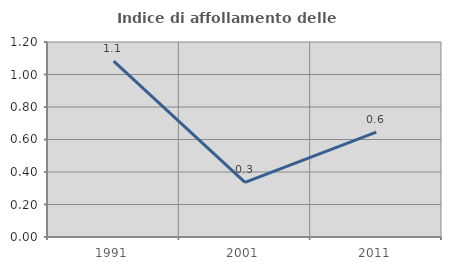
| Category | Indice di affollamento delle abitazioni  |
|---|---|
| 1991.0 | 1.083 |
| 2001.0 | 0.336 |
| 2011.0 | 0.646 |